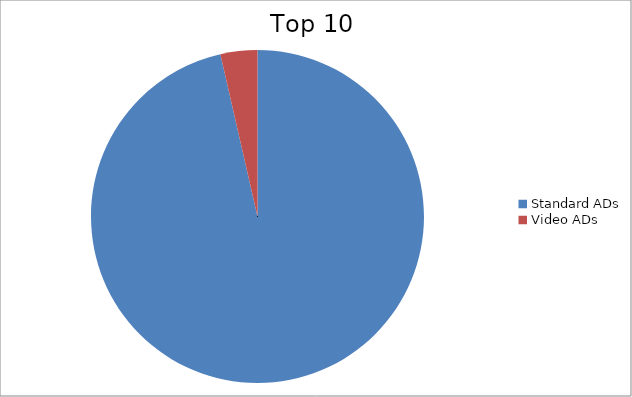
| Category | Series 0 |
|---|---|
| Standard ADs | 96.42 |
| Video ADs | 3.58 |